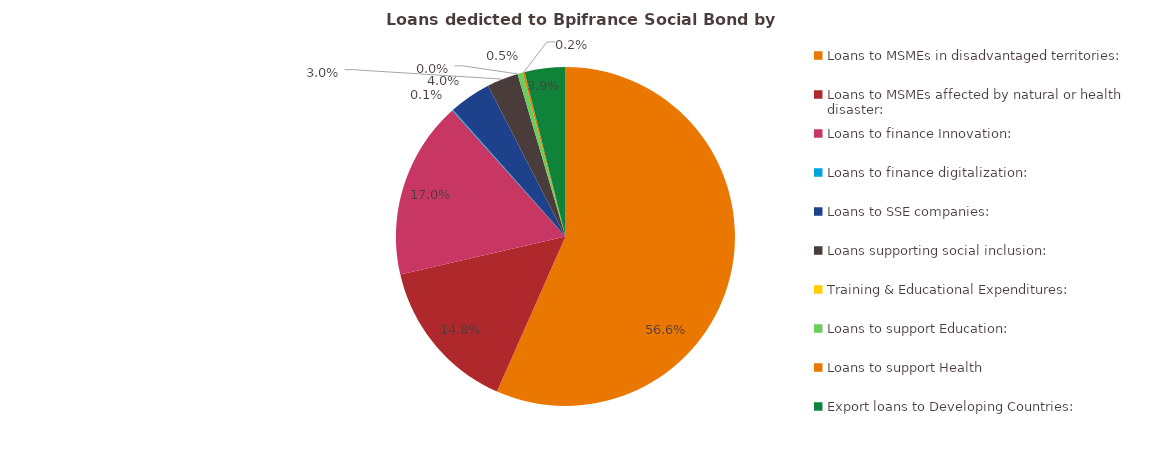
| Category | %  |
|---|---|
| Loans to MSMEs in disadvantaged territories: | 0.566 |
| Loans to MSMEs affected by natural or health disaster: | 0.148 |
| Loans to finance Innovation: | 0.17 |
| Loans to finance digitalization: | 0.001 |
| Loans to SSE companies: | 0.04 |
| Loans supporting social inclusion: | 0.03 |
| Training & Educational Expenditures: | 0 |
| Loans to support Education: | 0.005 |
| Loans to support Health | 0.002 |
| Export loans to Developing Countries: | 0.039 |